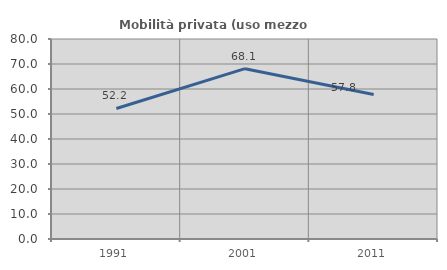
| Category | Mobilità privata (uso mezzo privato) |
|---|---|
| 1991.0 | 52.212 |
| 2001.0 | 68.137 |
| 2011.0 | 57.823 |